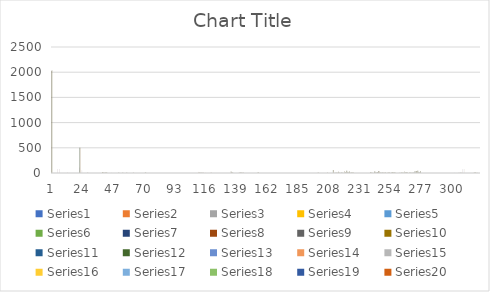
| Category | Series 0 | Series 1 | Series 2 | Series 3 | Series 4 | Series 5 | Series 6 | Series 7 | Series 8 | Series 9 | Series 10 | Series 11 | Series 12 | Series 13 | Series 14 | Series 15 | Series 16 | Series 17 | Series 18 | Series 19 |
|---|---|---|---|---|---|---|---|---|---|---|---|---|---|---|---|---|---|---|---|---|
| 0 | 2021 | 2022 | 2023 | 2024 | 2025 | 2026 | 2027 | 2028 | 2029 | 2030 | 2031 | 2032 | 2033 | 2034 | 2035 | 2036 | 2037 | 2038 | 2039 | 2040 |
| 1 | 0 | 0 | 0 | 0 | 0 | 0 | 0 | 0 | 0 | 0 | 0 | 0 | 0 | 0 | 0 | 0 | 0 | 0 | 0 | 0 |
| 2 | 0 | 0 | 0 | 0 | 0 | 0 | 0 | 0 | 0 | 0 | 0 | 0 | 0 | 0 | 0 | 0 | 0 | 0 | 0 | 0 |
| 3 | 0 | 0 | 0 | 0 | 0 | 0 | 0 | 0 | 0 | 0 | 0 | 0 | 0 | 0 | 0 | 0 | 0 | 0 | 0 | 0 |
| 4 | 0 | 0 | 0 | 0 | 0 | 0 | 0 | 0 | 0 | 0 | 0 | 0 | 0 | 0 | 0 | 0 | 0 | 0 | 0 | 0 |
| 5 | 78.394 | 77.848 | 77.764 | 0 | 0 | 0 | 0 | 0 | 0 | 0 | 0 | 0 | 0 | 0 | 0 | 0 | 0 | 0 | 0 | 0 |
| 6 | 79.574 | 79.02 | 78.935 | 0 | 0 | 0 | 0 | 0 | 0 | 0 | 0 | 0 | 0 | 0 | 0 | 0 | 0 | 0 | 0 | 0 |
| 7 | 0 | 0 | 0 | 0 | 0 | 0 | 0 | 0 | 0 | 0 | 0 | 0 | 0 | 0 | 0 | 0 | 0 | 0 | 0 | 0 |
| 8 | 0 | 0 | 0 | 0 | 0 | 0 | 0 | 0 | 0 | 0 | 0 | 0 | 0 | 0 | 0 | 0 | 0 | 0 | 0 | 0 |
| 9 | 0 | 0 | 0 | 0 | 0 | 0 | 0 | 0 | 0 | 0 | 0 | 0 | 0 | 0 | 0 | 0 | 0 | 0 | 0 | 0 |
| 10 | 0 | 0 | 0 | 0 | 0 | 0 | 0 | 0 | 0 | 0 | 0 | 0 | 0 | 0 | 0 | 0 | 0 | 0 | 0 | 0 |
| 11 | 0 | 0 | 0 | 0 | 0 | 0 | 0 | 0 | 0 | 0 | 0 | 0 | 0 | 0 | 0 | 0 | 0 | 0 | 0 | 0 |
| 12 | 16.387 | 16.273 | 16.256 | 0 | 0 | 0 | 0 | 0 | 0 | 0 | 0 | 0 | 0 | 0 | 0 | 0 | 0 | 0 | 0 | 0 |
| 13 | 0 | 0 | 0 | 0 | 0 | 0 | 0 | 0 | 0 | 0 | 0 | 0 | 0 | 0 | 0 | 0 | 0 | 0 | 0 | 0 |
| 14 | 0 | 0 | 0 | 0 | 0 | 0 | 0 | 0 | 0 | 0 | 0 | 0 | 0 | 0 | 0 | 0 | 0 | 0 | 0 | 0 |
| 15 | 0 | 0 | 0 | 0 | 0 | 0 | 0 | 0 | 0 | 0 | 0 | 0 | 0 | 0 | 0 | 0 | 0 | 0 | 0 | 0 |
| 16 | 0 | 0 | 0 | 0 | 0 | 0 | 0 | 0 | 0 | 0 | 0 | 0 | 0 | 0 | 0 | 0 | 0 | 0 | 0 | 0 |
| 17 | 0 | 0 | 0 | 0 | 0 | 0 | 0 | 0 | 0 | 0 | 0 | 0 | 0 | 0 | 0 | 0 | 0 | 0 | 0 | 0 |
| 18 | 0 | 0 | 0 | 0 | 0 | 0 | 0 | 0 | 0 | 0 | 0 | 0 | 0 | 0 | 0 | 0 | 0 | 0 | 0 | 0 |
| 19 | 0 | 0 | 0 | 0 | 0 | 0 | 0 | 0 | 0 | 0 | 0 | 0 | 0 | 0 | 0 | 0 | 0 | 0 | 0 | 0 |
| 20 | 0 | 0 | 0 | 0 | 0 | 0 | 0 | 0 | 0 | 0 | 0 | 0 | 0 | 0 | 0 | 0 | 0 | 0 | 0 | 0 |
| 21 | 110.726 | 109.955 | 109.836 | 500 | 500 | 500 | 500 | 500 | 500 | 500 | 500 | 500 | 500 | 500 | 500 | 500 | 500 | 500 | 500 | 500 |
| 22 | 0 | 0 | 0 | 0 | 0 | 0 | 0 | 0 | 0 | 0 | 0 | 0 | 0 | 0 | 0 | 0 | 0 | 0 | 0 | 0 |
| 23 | 52.484 | 52.118 | 52.062 | 0 | 0 | 0 | 0 | 0 | 0 | 0 | 0 | 0 | 0 | 0 | 0 | 0 | 0 | 0 | 0 | 0 |
| 24 | 0 | 0 | 0 | 0 | 0 | 0 | 0 | 0 | 0 | 0 | 0 | 0 | 0 | 0 | 0 | 0 | 0 | 0 | 0 | 0 |
| 25 | 0 | 0 | 0 | 0 | 0 | 0 | 0 | 0 | 0 | 0 | 0 | 0 | 0 | 0 | 0 | 0 | 0 | 0 | 0 | 0 |
| 26 | 0 | 0 | 0 | 0 | 0 | 0 | 0 | 0 | 0 | 0 | 0 | 0 | 0 | 0 | 0 | 0 | 0 | 0 | 0 | 0 |
| 27 | 2.564 | 2.557 | 2.549 | 2.567 | 2.567 | 2.567 | 2.567 | 2.567 | 2.567 | 2.567 | 2.567 | 2.567 | 2.567 | 2.567 | 2.567 | 2.567 | 2.567 | 0 | 0 | 0 |
| 28 | 0 | 0 | 0 | 0 | 0 | 0 | 0 | 0 | 0 | 0 | 0 | 0 | 0 | 0 | 0 | 0 | 0 | 0 | 0 | 0 |
| 29 | 0 | 0 | 0 | 0 | 0 | 0 | 0 | 0 | 0 | 0 | 0 | 0 | 0 | 0 | 0 | 0 | 0 | 0 | 0 | 0 |
| 30 | 0 | 0 | 0 | 0 | 0 | 0 | 0 | 0 | 0 | 0 | 0 | 0 | 0 | 0 | 0 | 0 | 0 | 0 | 0 | 0 |
| 31 | 0 | 0 | 0 | 0 | 0 | 0 | 0 | 0 | 0 | 0 | 0 | 0 | 0 | 0 | 0 | 0 | 0 | 0 | 0 | 0 |
| 32 | 0 | 0 | 0 | 0 | 0 | 0 | 0 | 0 | 0 | 0 | 0 | 0 | 0 | 0 | 0 | 0 | 0 | 0 | 0 | 0 |
| 33 | 0 | 0 | 0 | 0 | 0 | 0 | 0 | 0 | 0 | 0 | 0 | 0 | 0 | 0 | 0 | 0 | 0 | 0 | 0 | 0 |
| 34 | 0 | 0 | 0 | 0 | 0 | 0 | 0 | 0 | 0 | 0 | 0 | 0 | 0 | 0 | 0 | 0 | 0 | 0 | 0 | 0 |
| 35 | 0 | 0 | 0 | 0 | 0 | 0 | 0 | 0 | 0 | 0 | 0 | 0 | 0 | 0 | 0 | 0 | 0 | 0 | 0 | 0 |
| 36 | 0.28 | 0.279 | 0.278 | 0.28 | 0.28 | 0.28 | 0.28 | 0.28 | 0.28 | 0.28 | 0.28 | 0.28 | 0.28 | 0.28 | 0.28 | 0.28 | 0.28 | 0.28 | 0.28 | 0.28 |
| 37 | 0.332 | 0.331 | 0.329 | 0.332 | 0.332 | 0.332 | 0.332 | 0.332 | 0.332 | 0.332 | 0.332 | 0.332 | 0.332 | 0.332 | 0.332 | 0.332 | 0.332 | 0.332 | 0.332 | 0.332 |
| 38 | 19.173 | 19.118 | 19.054 | 19.189 | 19.189 | 19.189 | 19.189 | 19.189 | 19.189 | 19.189 | 19.189 | 19.189 | 19.189 | 19.189 | 19.189 | 19.189 | 19.189 | 19.189 | 19.189 | 19.189 |
| 39 | 5.592 | 5.576 | 5.558 | 5.597 | 5.597 | 5.597 | 5.597 | 5.597 | 5.597 | 5.597 | 5.597 | 5.597 | 5.597 | 5.597 | 5.597 | 5.597 | 5.597 | 5.597 | 5.597 | 5.597 |
| 40 | 10.705 | 10.674 | 10.639 | 10.714 | 10.714 | 10.714 | 10.714 | 10.714 | 10.714 | 10.714 | 10.714 | 10.714 | 10.714 | 10.714 | 10.714 | 10.714 | 10.714 | 10.714 | 10.714 | 10.714 |
| 41 | 10.865 | 10.833 | 10.797 | 10.874 | 10.874 | 10.874 | 10.874 | 10.874 | 10.874 | 10.874 | 10.874 | 10.874 | 10.874 | 10.874 | 10.874 | 10.874 | 10.874 | 10.874 | 10.874 | 10.874 |
| 42 | 1.598 | 1.593 | 0 | 0 | 0 | 0 | 0 | 0 | 0 | 0 | 0 | 0 | 0 | 0 | 0 | 0 | 0 | 0 | 0 | 0 |
| 43 | 2.157 | 2.151 | 0 | 0 | 0 | 0 | 0 | 0 | 0 | 0 | 0 | 0 | 0 | 0 | 0 | 0 | 0 | 0 | 0 | 0 |
| 44 | 1.438 | 1.434 | 0 | 0 | 0 | 0 | 0 | 0 | 0 | 0 | 0 | 0 | 0 | 0 | 0 | 0 | 0 | 0 | 0 | 0 |
| 45 | 7.828 | 7.805 | 0 | 0 | 0 | 0 | 0 | 0 | 0 | 0 | 0 | 0 | 0 | 0 | 0 | 0 | 0 | 0 | 0 | 0 |
| 46 | 1.198 | 1.195 | 1.191 | 1.199 | 1.199 | 1.199 | 1.199 | 1.199 | 1.199 | 1.199 | 1.199 | 1.199 | 1.199 | 1.199 | 1.199 | 1.199 | 1.199 | 1.199 | 1.199 | 1.199 |
| 47 | 2.077 | 2.071 | 2.064 | 2.079 | 2.079 | 2.079 | 2.079 | 2.079 | 2.079 | 2.079 | 2.079 | 2.079 | 2.079 | 2.079 | 2.079 | 2.079 | 2.079 | 2.079 | 2.079 | 2.079 |
| 48 | 0.879 | 0.876 | 0.873 | 0.88 | 0.88 | 0.88 | 0.88 | 0.88 | 0.88 | 0.88 | 0.88 | 0.88 | 0.88 | 0.88 | 0.88 | 0.88 | 0.88 | 0.88 | 0.88 | 0.88 |
| 49 | 2.317 | 2.31 | 2.302 | 2.319 | 2.319 | 2.319 | 2.319 | 2.319 | 2.319 | 2.319 | 2.319 | 2.319 | 2.319 | 2.319 | 2.319 | 2.319 | 2.319 | 2.319 | 2.319 | 2.319 |
| 50 | 2.636 | 2.629 | 2.62 | 2.639 | 2.639 | 2.639 | 2.639 | 2.639 | 2.639 | 2.639 | 2.639 | 2.639 | 2.639 | 2.639 | 2.639 | 2.639 | 2.639 | 2.639 | 2.639 | 2.639 |
| 51 | 1.438 | 1.434 | 1.429 | 1.439 | 1.439 | 1.439 | 1.439 | 1.439 | 1.439 | 1.439 | 1.439 | 1.439 | 1.439 | 1.439 | 1.439 | 1.439 | 1.439 | 1.439 | 1.439 | 1.439 |
| 52 | 0.879 | 0.876 | 0.873 | 0.88 | 0.88 | 0.88 | 0.88 | 0.88 | 0.88 | 0.88 | 0.88 | 0.88 | 0.88 | 0.88 | 0.88 | 0.88 | 0.88 | 0.88 | 0.88 | 0.88 |
| 53 | 3.395 | 3.385 | 3.374 | 3.398 | 3.398 | 3.398 | 3.398 | 3.398 | 3.398 | 3.398 | 3.398 | 3.398 | 3.398 | 3.398 | 3.398 | 3.398 | 3.398 | 3.398 | 3.398 | 3.398 |
| 54 | 0.224 | 0.223 | 0.222 | 0.224 | 0.224 | 0.224 | 0.224 | 0.224 | 0.224 | 0.224 | 0.224 | 0.224 | 0.224 | 0.224 | 0.224 | 0.224 | 0.224 | 0.224 | 0.224 | 0.224 |
| 55 | 0.367 | 0.366 | 0.365 | 0.368 | 0.368 | 0.368 | 0.368 | 0.368 | 0.368 | 0.368 | 0.368 | 0.368 | 0.368 | 0.368 | 0.368 | 0.368 | 0.368 | 0.368 | 0.368 | 0.368 |
| 56 | 2.876 | 2.868 | 2.858 | 2.878 | 2.878 | 2.878 | 2.878 | 2.878 | 2.878 | 2.878 | 2.878 | 2.878 | 2.878 | 2.878 | 2.878 | 2.878 | 2.878 | 2.878 | 2.878 | 2.878 |
| 57 | 0.575 | 0.574 | 0.572 | 0.576 | 0.576 | 0.576 | 0.576 | 0.576 | 0.576 | 0.576 | 0.576 | 0.576 | 0.576 | 0.576 | 0.576 | 0.576 | 0.576 | 0.576 | 0.576 | 0.576 |
| 58 | 0.072 | 0.072 | 0.071 | 0.072 | 0.072 | 0.072 | 0.072 | 0.072 | 0.072 | 0.072 | 0.072 | 0.072 | 0.072 | 0.072 | 0.072 | 0.072 | 0.072 | 0.072 | 0.072 | 0.072 |
| 59 | 0.627 | 0.625 | 0.623 | 0.628 | 0.628 | 0.628 | 0.628 | 0.628 | 0.628 | 0.628 | 0.628 | 0.628 | 0.628 | 0.628 | 0.628 | 0.628 | 0.628 | 0.628 | 0.628 | 0.628 |
| 60 | 2.397 | 2.39 | 2.382 | 2.399 | 2.399 | 2.399 | 2.399 | 2.399 | 2.399 | 2.399 | 2.399 | 2.399 | 2.399 | 2.399 | 2.399 | 2.399 | 2.399 | 2.399 | 2.399 | 2.399 |
| 61 | 2.636 | 2.629 | 2.62 | 2.639 | 2.639 | 2.639 | 2.639 | 2.639 | 2.639 | 2.639 | 2.639 | 2.639 | 2.639 | 2.639 | 2.639 | 2.639 | 2.639 | 2.639 | 2.639 | 2.639 |
| 62 | 0.087 | 0.087 | 0.087 | 0.087 | 0.087 | 0.087 | 0.087 | 0.087 | 0.087 | 0.087 | 0.087 | 0.087 | 0.087 | 0.087 | 0.087 | 0.087 | 0.087 | 0.087 | 0.087 | 0.087 |
| 63 | 2.397 | 2.39 | 2.382 | 2.399 | 2.399 | 2.399 | 2.399 | 2.399 | 2.399 | 2.399 | 2.399 | 2.399 | 2.399 | 2.399 | 2.399 | 2.399 | 2.399 | 2.399 | 2.399 | 2.399 |
| 64 | 1.118 | 1.115 | 1.112 | 1.119 | 1.119 | 1.119 | 1.119 | 1.119 | 1.119 | 1.119 | 1.119 | 1.119 | 1.119 | 1.119 | 1.119 | 1.119 | 1.119 | 1.119 | 1.119 | 1.119 |
| 65 | 0.63 | 0.628 | 0.626 | 0.631 | 0.631 | 0.631 | 0.631 | 0.631 | 0.631 | 0.631 | 0.631 | 0.631 | 0.631 | 0.631 | 0.631 | 0.631 | 0.631 | 0.631 | 0.631 | 0.631 |
| 66 | 0.021 | 0.021 | 0.021 | 0.021 | 0.021 | 0.021 | 0.021 | 0.021 | 0.021 | 0.021 | 0.021 | 0.021 | 0.021 | 0.021 | 0.021 | 0.021 | 0.021 | 0.021 | 0.021 | 0.021 |
| 67 | 0.28 | 0.279 | 0.278 | 0.28 | 0.28 | 0.28 | 0.28 | 0.28 | 0.28 | 0.28 | 0.28 | 0.28 | 0.28 | 0.28 | 0.28 | 0.28 | 0.28 | 0.28 | 0.28 | 0.28 |
| 68 | 0.088 | 0.088 | 0.087 | 0.088 | 0.088 | 0.088 | 0.088 | 0.088 | 0.088 | 0.088 | 0.088 | 0.088 | 0.088 | 0.088 | 0.088 | 0.088 | 0.088 | 0.088 | 0.088 | 0.088 |
| 69 | 1.758 | 1.752 | 1.747 | 0 | 0 | 0 | 0 | 0 | 0 | 0 | 0 | 0 | 0 | 0 | 0 | 0 | 0 | 0 | 0 | 0 |
| 70 | 10.386 | 10.356 | 10.321 | 10.394 | 10.394 | 10.394 | 10.394 | 10.394 | 10.394 | 10.394 | 10.394 | 10.394 | 10.394 | 10.394 | 10.394 | 10.394 | 10.394 | 10.394 | 10.394 | 10.394 |
| 71 | 0 | 0 | 0 | 0 | 0 | 0 | 0 | 0 | 0 | 0 | 0 | 0 | 0 | 0 | 0 | 0 | 0 | 0 | 0 | 0 |
| 72 | 0 | 0 | 0 | 0 | 0 | 0 | 0 | 0 | 0 | 0 | 0 | 0 | 0 | 0 | 0 | 0 | 0 | 0 | 0 | 0 |
| 73 | 0 | 0 | 0 | 0 | 0 | 0 | 0 | 0 | 0 | 0 | 0 | 0 | 0 | 0 | 0 | 0 | 0 | 0 | 0 | 0 |
| 74 | 0 | 0 | 0 | 0 | 0 | 0 | 0 | 0 | 0 | 0 | 0 | 0 | 0 | 0 | 0 | 0 | 0 | 0 | 0 | 0 |
| 75 | 0 | 0 | 0 | 0 | 0 | 0 | 0 | 0 | 0 | 0 | 0 | 0 | 0 | 0 | 0 | 0 | 0 | 0 | 0 | 0 |
| 76 | 0 | 0 | 0 | 0 | 0 | 0 | 0 | 0 | 0 | 0 | 0 | 0 | 0 | 0 | 0 | 0 | 0 | 0 | 0 | 0 |
| 77 | 0 | 0 | 0 | 0 | 0 | 0 | 0 | 0 | 0 | 0 | 0 | 0 | 0 | 0 | 0 | 0 | 0 | 0 | 0 | 0 |
| 78 | 0 | 0 | 0 | 0 | 0 | 0 | 0 | 0 | 0 | 0 | 0 | 0 | 0 | 0 | 0 | 0 | 0 | 0 | 0 | 0 |
| 79 | 0 | 0 | 0 | 0 | 0 | 0 | 0 | 0 | 0 | 0 | 0 | 0 | 0 | 0 | 0 | 0 | 0 | 0 | 0 | 0 |
| 80 | 0 | 0 | 0 | 0 | 0 | 0 | 0 | 0 | 0 | 0 | 0 | 0 | 0 | 0 | 0 | 0 | 0 | 0 | 0 | 0 |
| 81 | 0 | 0 | 0 | 0 | 0 | 0 | 0 | 0 | 0 | 0 | 0 | 0 | 0 | 0 | 0 | 0 | 0 | 0 | 0 | 0 |
| 82 | 0 | 0 | 0 | 0 | 0 | 0 | 0 | 0 | 0 | 0 | 0 | 0 | 0 | 0 | 0 | 0 | 0 | 0 | 0 | 0 |
| 83 | 0 | 0 | 0 | 0 | 0 | 0 | 0 | 0 | 0 | 0 | 0 | 0 | 0 | 0 | 0 | 0 | 0 | 0 | 0 | 0 |
| 84 | 0 | 0 | 0 | 0 | 0 | 0 | 0 | 0 | 0 | 0 | 0 | 0 | 0 | 0 | 0 | 0 | 0 | 0 | 0 | 0 |
| 85 | 0 | 0 | 0 | 0 | 0 | 0 | 0 | 0 | 0 | 0 | 0 | 0 | 0 | 0 | 0 | 0 | 0 | 0 | 0 | 0 |
| 86 | 0 | 0 | 0 | 0 | 0 | 0 | 0 | 0 | 0 | 0 | 0 | 0 | 0 | 0 | 0 | 0 | 0 | 0 | 0 | 0 |
| 87 | 0 | 0 | 0 | 0 | 0 | 0 | 0 | 0 | 0 | 0 | 0 | 0 | 0 | 0 | 0 | 0 | 0 | 0 | 0 | 0 |
| 88 | 0 | 0 | 0 | 0 | 0 | 0 | 0 | 0 | 0 | 0 | 0 | 0 | 0 | 0 | 0 | 0 | 0 | 0 | 0 | 0 |
| 89 | 0 | 0 | 0 | 0 | 0 | 0 | 0 | 0 | 0 | 0 | 0 | 0 | 0 | 0 | 0 | 0 | 0 | 0 | 0 | 0 |
| 90 | 0 | 0 | 0 | 0 | 0 | 0 | 0 | 0 | 0 | 0 | 0 | 0 | 0 | 0 | 0 | 0 | 0 | 0 | 0 | 0 |
| 91 | 0 | 0 | 0 | 0 | 0 | 0 | 0 | 0 | 0 | 0 | 0 | 0 | 0 | 0 | 0 | 0 | 0 | 0 | 0 | 0 |
| 92 | 0 | 0 | 0 | 0 | 0 | 0 | 0 | 0 | 0 | 0 | 0 | 0 | 0 | 0 | 0 | 0 | 0 | 0 | 0 | 0 |
| 93 | 0 | 0 | 0 | 0 | 0 | 0 | 0 | 0 | 0 | 0 | 0 | 0 | 0 | 0 | 0 | 0 | 0 | 0 | 0 | 0 |
| 94 | 0 | 0 | 0 | 0 | 0 | 0 | 0 | 0 | 0 | 0 | 0 | 0 | 0 | 0 | 0 | 0 | 0 | 0 | 0 | 0 |
| 95 | 0 | 0 | 0 | 0 | 0 | 0 | 0 | 0 | 0 | 0 | 0 | 0 | 0 | 0 | 0 | 0 | 0 | 0 | 0 | 0 |
| 96 | 0 | 0 | 0 | 0 | 0 | 0 | 0 | 0 | 0 | 0 | 0 | 0 | 0 | 0 | 0 | 0 | 0 | 0 | 0 | 0 |
| 97 | 0 | 0 | 0 | 0 | 0 | 0 | 0 | 0 | 0 | 0 | 0 | 0 | 0 | 0 | 0 | 0 | 0 | 0 | 0 | 0 |
| 98 | 0 | 0 | 0 | 0 | 0 | 0 | 0 | 0 | 0 | 0 | 0 | 0 | 0 | 0 | 0 | 0 | 0 | 0 | 0 | 0 |
| 99 | 0 | 0 | 0 | 0 | 0 | 0 | 0 | 0 | 0 | 0 | 0 | 0 | 0 | 0 | 0 | 0 | 0 | 0 | 0 | 0 |
| 100 | 0 | 0 | 0 | 0 | 0 | 0 | 0 | 0 | 0 | 0 | 0 | 0 | 0 | 0 | 0 | 0 | 0 | 0 | 0 | 0 |
| 101 | 0 | 0 | 0 | 0 | 0 | 0 | 0 | 0 | 0 | 0 | 0 | 0 | 0 | 0 | 0 | 0 | 0 | 0 | 0 | 0 |
| 102 | 0 | 0 | 0 | 0 | 0 | 0 | 0 | 0 | 0 | 0 | 0 | 0 | 0 | 0 | 0 | 0 | 0 | 0 | 0 | 0 |
| 103 | 0 | 0 | 0 | 0 | 0 | 0 | 0 | 0 | 0 | 0 | 0 | 0 | 0 | 0 | 0 | 0 | 0 | 0 | 0 | 0 |
| 104 | 0 | 0 | 0 | 0 | 0 | 0 | 0 | 0 | 0 | 0 | 0 | 0 | 0 | 0 | 0 | 0 | 0 | 0 | 0 | 0 |
| 105 | 0 | 0 | 0 | 0 | 0 | 0 | 0 | 0 | 0 | 0 | 0 | 0 | 0 | 0 | 0 | 0 | 0 | 0 | 0 | 0 |
| 106 | 0 | 0 | 0 | 0 | 0 | 0 | 0 | 0 | 0 | 0 | 0 | 0 | 0 | 0 | 0 | 0 | 0 | 0 | 0 | 0 |
| 107 | 0 | 0 | 0 | 0 | 0 | 0 | 0 | 0 | 0 | 0 | 0 | 0 | 0 | 0 | 0 | 0 | 0 | 0 | 0 | 0 |
| 108 | 0 | 0 | 0 | 0 | 0 | 0 | 0 | 0 | 0 | 0 | 0 | 0 | 0 | 0 | 0 | 0 | 0 | 0 | 0 | 0 |
| 109 | 0 | 0 | 0 | 0 | 0 | 0 | 0 | 0 | 0 | 0 | 0 | 0 | 0 | 0 | 0 | 0 | 0 | 0 | 0 | 24.992 |
| 110 | 8.628 | 8.603 | 8.574 | 8.635 | 8.635 | 8.635 | 8.635 | 8.635 | 8.635 | 8.635 | 8.635 | 8.635 | 8.635 | 8.635 | 8.635 | 8.635 | 8.635 | 8.635 | 8.635 | 8.635 |
| 111 | 5.353 | 5.337 | 5.319 | 5.357 | 5.357 | 5.357 | 5.357 | 5.357 | 5.357 | 5.357 | 5.357 | 5.357 | 5.357 | 5.357 | 5.357 | 5.357 | 5.357 | 5.357 | 5.357 | 5.357 |
| 112 | 5.512 | 5.496 | 5.478 | 5.517 | 5.517 | 5.517 | 5.517 | 5.517 | 5.517 | 5.345 | 5.517 | 5.517 | 5.359 | 5.227 | 5.161 | 5.093 | 5.35 | 5.219 | 5.192 | 5.123 |
| 113 | 3.795 | 3.784 | 3.771 | 3.798 | 3.798 | 3.798 | 3.798 | 3.798 | 3.798 | 3.798 | 3.798 | 3.798 | 3.798 | 3.798 | 3.798 | 3.798 | 3.798 | 3.798 | 3.798 | 3.798 |
| 114 | 0 | 0 | 0 | 0 | 0 | 0 | 0 | 0 | 0 | 0 | 0 | 0 | 0 | 0 | 0 | 0 | 0 | 0 | 0 | 0 |
| 115 | 7.309 | 7.288 | 7.264 | 7.315 | 0 | 0 | 0 | 0 | 0 | 0 | 0 | 0 | 0 | 0 | 0 | 0 | 0 | 0 | 0 | 0 |
| 116 | 0.109 | 0.109 | 0.109 | 0.11 | 0.11 | 0.11 | 0.11 | 0.11 | 0.11 | 0.11 | 0.11 | 0.11 | 0.11 | 0.11 | 0.11 | 0.11 | 0.11 | 0.11 | 0.11 | 0.11 |
| 117 | 0.139 | 0.139 | 0.138 | 0 | 0 | 0 | 0 | 0 | 0 | 0 | 0 | 0 | 0 | 0 | 0 | 0 | 0 | 0 | 0 | 0 |
| 118 | 2.012 | 2.007 | 2 | 0 | 0 | 0 | 0 | 0 | 0 | 0 | 0 | 0 | 0 | 0 | 0 | 0 | 0 | 0 | 0 | 0 |
| 119 | 6.172 | 6.154 | 6.134 | 6.177 | 6.177 | 6.177 | 6.177 | 6.177 | 6.177 | 6.177 | 6.177 | 6.177 | 6.177 | 6.177 | 6.177 | 6.177 | 6.177 | 6.177 | 6.177 | 6.177 |
| 120 | 0.611 | 0 | 0 | 0 | 0 | 0 | 0 | 0 | 0 | 0 | 0 | 0 | 0 | 0 | 0 | 0 | 0 | 0 | 0 | 0 |
| 121 | 0.259 | 0 | 0 | 0 | 0 | 0 | 0 | 0 | 0 | 0 | 0 | 0 | 0 | 0 | 0 | 0 | 0 | 0 | 0 | 0 |
| 122 | 0.786 | 0.783 | 0.781 | 0 | 0 | 0 | 0 | 0 | 0 | 0 | 0 | 0 | 0 | 0 | 0 | 0 | 0 | 0 | 0 | 0 |
| 123 | 0.142 | 0.142 | 0.141 | 0 | 0 | 0 | 0 | 0 | 0 | 0 | 0 | 0 | 0 | 0 | 0 | 0 | 0 | 0 | 0 | 0 |
| 124 | 1.217 | 1.214 | 1.21 | 0 | 0 | 0 | 0 | 0 | 0 | 0 | 0 | 0 | 0 | 0 | 0 | 0 | 0 | 0 | 0 | 0 |
| 125 | 0.583 | 0.582 | 0.58 | 0.584 | 0.584 | 0.584 | 0.584 | 0.584 | 0.584 | 0.584 | 0.584 | 0.584 | 0.584 | 0.584 | 0.584 | 0.584 | 0.584 | 0.584 | 0.584 | 0.584 |
| 126 | 0.583 | 0.582 | 0.58 | 0.584 | 0.584 | 0.584 | 0.584 | 0.584 | 0.584 | 0.584 | 0.584 | 0.584 | 0.584 | 0.584 | 0.584 | 0.584 | 0.584 | 0.584 | 0.584 | 0.584 |
| 127 | 0.032 | 0.032 | 0.032 | 0.032 | 0.032 | 0.032 | 0.032 | 0.032 | 0.032 | 0.032 | 0.032 | 0.032 | 0.032 | 0.032 | 0.032 | 0.032 | 0.032 | 0.032 | 0.032 | 0.032 |
| 128 | 0.032 | 0.032 | 0.032 | 0.032 | 0.032 | 0.032 | 0.032 | 0.032 | 0.032 | 0.032 | 0.032 | 0.032 | 0.032 | 0.032 | 0.032 | 0.032 | 0.032 | 0.032 | 0.032 | 0.032 |
| 129 | 2.301 | 2.294 | 2.287 | 2.303 | 2.303 | 2.303 | 2.303 | 2.303 | 2.303 | 2.303 | 2.303 | 2.303 | 2.303 | 2.303 | 2.303 | 2.303 | 2.303 | 2.303 | 2.303 | 2.303 |
| 130 | 2.301 | 2.294 | 2.287 | 2.303 | 2.303 | 2.303 | 2.303 | 2.303 | 2.303 | 2.303 | 2.303 | 2.303 | 2.303 | 2.303 | 2.303 | 2.303 | 2.303 | 2.303 | 2.303 | 2.303 |
| 131 | 0.192 | 0.191 | 0.191 | 0.192 | 0.192 | 0.192 | 0.192 | 0.192 | 0.192 | 0.192 | 0.192 | 0.192 | 0.192 | 0.192 | 0.192 | 0.192 | 0.192 | 0.192 | 0.192 | 0.192 |
| 132 | 0.192 | 0.191 | 0.191 | 0.192 | 0.192 | 0.192 | 0.192 | 0.192 | 0.192 | 0.192 | 0.192 | 0.192 | 0.192 | 0.192 | 0.192 | 0.192 | 0.192 | 0.192 | 0.192 | 0.192 |
| 133 | 0 | 0 | 0 | 0 | 0 | 0 | 0 | 0 | 0 | 0 | 0 | 0 | 0 | 0 | 0 | 0 | 0 | 34.49 | 34.49 | 34.49 |
| 134 | 0 | 0 | 0 | 0 | 0 | 0 | 0 | 25.735 | 25.735 | 25.735 | 25.735 | 25.735 | 25.735 | 25.735 | 25.735 | 25.735 | 25.735 | 25.735 | 25.735 | 25.735 |
| 135 | 7.973 | 7.91 | 7.844 | 7.86 | 7.821 | 7.782 | 7.743 | 7.705 | 7.666 | 7.628 | 7.589 | 7.552 | 7.514 | 7.477 | 7.439 | 7.402 | 7.365 | 7.328 | 7.291 | 7.254 |
| 136 | 0 | 0 | 0 | 0 | 0 | 0 | 0 | 0 | 0 | 0 | 0 | 0 | 0 | 0 | 0 | 0 | 0 | 0 | 0 | 0 |
| 137 | 0 | 0 | 0 | 0 | 0 | 0 | 0 | 0 | 0 | 0 | 0 | 0 | 0 | 0 | 0 | 0 | 0 | 0 | 0 | 0 |
| 138 | 0 | 0 | 0 | 0 | 0 | 0 | 0 | 0 | 0 | 0 | 0 | 0 | 0 | 0 | 0 | 0 | 0 | 0 | 0 | 0 |
| 139 | 0 | 0 | 0 | 0 | 0 | 0 | 0 | 0 | 0 | 0 | 0 | 0 | 0 | 0 | 0 | 0 | 0 | 0 | 0 | 0 |
| 140 | 4.634 | 4.602 | 4.568 | 4.582 | 4.564 | 4.545 | 4.527 | 4.509 | 4.49 | 4.473 | 4.455 | 4.438 | 4.42 | 4.402 | 4.385 | 4.367 | 4.35 | 4.332 | 4.314 | 4.297 |
| 141 | 7.949 | 7.886 | 7.821 | 7.837 | 7.798 | 7.759 | 7.72 | 7.681 | 7.643 | 7.605 | 7.566 | 7.529 | 7.491 | 7.453 | 7.416 | 7.379 | 7.342 | 7.306 | 7.269 | 7.233 |
| 142 | 7.909 | 7.827 | 7.742 | 7.739 | 7.681 | 7.623 | 7.565 | 7.509 | 7.453 | 7.397 | 7.342 | 7.286 | 7.232 | 7.178 | 7.124 | 7.071 | 7.018 | 6.965 | 6.913 | 6.861 |
| 143 | 6.359 | 6.309 | 6.256 | 6.269 | 6.238 | 6.207 | 6.176 | 6.145 | 6.114 | 6.084 | 6.053 | 6.023 | 5.993 | 5.963 | 5.934 | 5.904 | 5.874 | 5.845 | 5.815 | 5.786 |
| 144 | 0 | 0 | 0 | 0 | 0 | 0 | 0 | 0 | 0 | 0 | 0 | 0 | 0 | 0 | 0 | 0 | 0 | 0 | 0 | 0 |
| 145 | 0 | 0 | 0 | 0 | 0 | 0 | 0 | 0 | 0 | 0 | 0 | 0 | 0 | 0 | 0 | 0 | 0 | 0 | 0 | 0 |
| 146 | 0 | 0 | 0 | 0 | 0 | 0 | 0 | 0 | 0 | 0 | 0 | 0 | 0 | 0 | 0 | 0 | 0 | 0 | 0 | 0 |
| 147 | 0 | 0 | 0 | 0 | 0 | 0 | 0 | 0 | 0 | 0 | 0 | 0 | 0 | 0 | 0 | 0 | 0 | 0 | 0 | 0 |
| 148 | 0 | 0 | 0 | 0 | 0 | 0 | 0 | 0 | 0 | 0 | 0 | 0 | 0 | 0 | 0 | 0 | 0 | 0 | 0 | 0 |
| 149 | 0 | 0 | 0 | 0 | 0 | 0 | 0 | 0 | 0 | 0 | 0 | 0 | 0 | 0 | 0 | 0 | 0 | 0 | 0 | 0 |
| 150 | 0 | 0 | 0 | 0 | 0 | 0 | 0 | 0 | 0 | 0 | 0 | 0 | 0 | 0 | 0 | 0 | 0 | 0 | 0 | 0 |
| 151 | 0 | 0 | 0 | 0 | 0 | 0 | 0 | 0 | 0 | 0 | 0 | 0 | 0 | 0 | 0 | 0 | 0 | 0 | 0 | 0 |
| 152 | 0 | 0 | 0 | 0 | 0 | 0 | 0 | 0 | 0 | 0 | 0 | 0 | 0 | 0 | 0 | 0 | 0 | 0 | 0 | 0 |
| 153 | 0 | 0 | 0 | 0 | 0 | 0 | 0 | 0 | 0 | 0 | 0 | 0 | 0 | 0 | 0 | 0 | 0 | 0 | 0 | 0 |
| 154 | 0 | 0 | 0 | 14.195 | 14.195 | 14.124 | 14.053 | 13.983 | 13.913 | 13.843 | 13.774 | 13.705 | 13.637 | 13.569 | 13.501 | 13.433 | 13.366 | 13.299 | 13.233 | 13.167 |
| 155 | 0 | 0 | 0 | 0 | 0 | 0 | 0 | 0 | 0 | 0 | 0 | 0 | 0 | 0 | 0 | 0 | 0 | 0 | 0 | 0 |
| 156 | 2.164 | 2.149 | 2.146 | 2.171 | 2.171 | 2.171 | 2.171 | 2.171 | 2.171 | 0 | 0 | 0 | 0 | 0 | 0 | 0 | 0 | 0 | 0 | 0 |
| 157 | 2.182 | 2.166 | 2.164 | 2.189 | 2.189 | 2.189 | 2.189 | 2.189 | 2.189 | 0 | 0 | 0 | 0 | 0 | 0 | 0 | 0 | 0 | 0 | 0 |
| 158 | 2.164 | 2.149 | 2.146 | 2.171 | 2.171 | 2.171 | 2.171 | 2.171 | 2.171 | 0 | 0 | 0 | 0 | 0 | 0 | 0 | 0 | 0 | 0 | 0 |
| 159 | 0 | 0 | 0 | 0 | 0 | 0 | 0 | 0 | 0 | 0 | 0 | 0 | 0 | 0 | 0 | 0 | 0 | 0 | 0 | 0 |
| 160 | 1.843 | 1.83 | 1.828 | 1.85 | 1.85 | 1.85 | 1.85 | 1.85 | 1.85 | 0 | 0 | 0 | 0 | 0 | 0 | 0 | 0 | 0 | 0 | 0 |
| 161 | 0 | 0 | 0 | 0 | 0 | 0 | 0 | 0 | 0 | 0 | 0 | 0 | 0 | 0 | 0 | 0 | 0 | 0 | 0 | 0 |
| 162 | 0 | 0 | 0 | 0 | 0 | 0 | 0 | 0 | 0 | 0 | 0 | 0 | 0 | 0 | 0 | 0 | 0 | 0 | 0 | 0 |
| 163 | 0 | 0 | 0 | 0 | 0 | 0 | 0 | 0 | 0 | 0 | 0 | 0 | 0 | 0 | 0 | 0 | 0 | 0 | 0 | 0 |
| 164 | 0 | 0 | 0 | 0 | 0 | 0 | 0 | 0 | 0 | 0 | 0 | 0 | 0 | 0 | 0 | 0 | 0 | 0 | 0 | 0 |
| 165 | 0 | 0 | 0 | 0 | 0 | 0 | 0 | 0 | 0 | 0 | 0 | 0 | 0 | 0 | 0 | 0 | 0 | 0 | 0 | 0 |
| 166 | 0 | 0 | 0 | 0 | 0 | 0 | 0 | 0 | 0 | 0 | 0 | 0 | 0 | 0 | 0 | 0 | 0 | 0 | 0 | 0 |
| 167 | 0 | 0 | 0 | 0 | 0 | 0 | 0 | 0 | 0 | 0 | 0 | 0 | 0 | 0 | 0 | 0 | 0 | 0 | 0 | 0 |
| 168 | 0 | 0 | 0 | 0 | 0 | 0 | 0 | 0 | 0 | 0 | 0 | 0 | 0 | 0 | 0 | 0 | 0 | 0 | 0 | 0 |
| 169 | 0 | 0 | 0 | 0 | 0 | 0 | 0 | 0 | 0 | 0 | 0 | 0 | 0 | 0 | 0 | 0 | 0 | 0 | 0 | 0 |
| 170 | 0 | 0 | 0 | 0 | 0 | 0 | 0 | 0 | 0 | 0 | 0 | 0 | 0 | 0 | 0 | 0 | 0 | 0 | 0 | 0 |
| 171 | 0 | 0 | 0 | 0 | 0 | 0 | 0 | 0 | 0 | 0 | 0 | 0 | 0 | 0 | 0 | 0 | 0 | 0 | 0 | 0 |
| 172 | 0 | 0 | 0 | 0 | 0 | 0 | 0 | 0 | 0 | 0 | 0 | 0 | 0 | 0 | 0 | 0 | 0 | 0 | 0 | 0 |
| 173 | 0 | 0 | 0 | 0 | 0 | 0 | 0 | 0 | 0 | 0 | 0 | 0 | 0 | 0 | 0 | 0 | 0 | 0 | 0 | 0 |
| 174 | 0 | 0 | 0 | 0 | 0 | 0 | 0 | 0 | 0 | 0 | 0 | 0 | 0 | 0 | 0 | 0 | 0 | 0 | 0 | 0 |
| 175 | 0 | 0 | 0 | 0 | 0 | 0 | 0 | 0 | 0 | 0 | 0 | 0 | 0 | 0 | 0 | 0 | 0 | 0 | 0 | 0 |
| 176 | 0 | 0 | 0 | 0 | 0 | 0 | 0 | 0 | 0 | 0 | 0 | 0 | 0 | 0 | 0 | 0 | 0 | 0 | 0 | 0 |
| 177 | 0 | 0 | 0 | 0 | 0 | 0 | 0 | 0 | 0 | 0 | 0 | 0 | 0 | 0 | 0 | 0 | 0 | 0 | 0 | 0 |
| 178 | 0 | 0 | 0 | 0 | 0 | 0 | 0 | 0 | 0 | 0 | 0 | 0 | 0 | 0 | 0 | 0 | 0 | 0 | 0 | 0 |
| 179 | 0 | 0 | 0 | 0 | 0 | 0 | 0 | 0 | 0 | 0 | 0 | 0 | 0 | 0 | 0 | 0 | 0 | 0 | 0 | 0 |
| 180 | 0 | 0 | 0 | 0 | 0 | 0 | 0 | 0 | 0 | 0 | 0 | 0 | 0 | 0 | 0 | 0 | 0 | 0 | 0 | 0 |
| 181 | 0 | 0 | 0 | 0 | 0 | 0 | 0 | 0 | 0 | 0 | 0 | 0 | 0 | 0 | 0 | 0 | 0 | 0 | 0 | 0 |
| 182 | 0 | 0 | 0 | 0 | 0 | 0 | 0 | 0 | 0 | 0 | 0 | 0 | 0 | 0 | 0 | 0 | 0 | 0 | 0 | 0 |
| 183 | 0 | 0 | 0 | 0 | 0 | 0 | 0 | 0 | 0 | 0 | 0 | 0 | 0 | 0 | 0 | 0 | 0 | 0 | 0 | 0 |
| 184 | 0 | 0 | 0 | 0 | 0 | 0 | 0 | 0 | 0 | 0 | 0 | 0 | 0 | 0 | 0 | 0 | 0 | 0 | 0 | 0 |
| 185 | 0 | 0 | 0 | 0 | 0 | 0 | 0 | 0 | 0 | 0 | 0 | 0 | 0 | 0 | 0 | 0 | 0 | 0 | 0 | 0 |
| 186 | 0 | 0 | 0 | 0 | 0 | 0 | 0 | 0 | 0 | 0 | 0 | 0 | 0 | 0 | 0 | 0 | 0 | 0 | 0 | 0 |
| 187 | 0 | 0 | 0 | 0 | 0 | 0 | 0 | 0 | 0 | 0 | 0 | 0 | 0 | 0 | 0 | 0 | 0 | 0 | 0 | 0 |
| 188 | 0 | 0 | 0 | 0 | 0 | 0 | 0 | 0 | 0 | 0 | 0 | 0 | 0 | 0 | 0 | 0 | 0 | 0 | 0 | 0 |
| 189 | 0 | 0 | 0 | 0 | 0 | 0 | 0 | 0 | 0 | 0 | 0 | 0 | 0 | 0 | 0 | 0 | 0 | 0 | 0 | 0 |
| 190 | 0 | 0 | 0 | 0 | 0 | 0 | 0 | 0 | 0 | 0 | 0 | 0 | 0 | 0 | 0 | 0 | 0 | 0 | 0 | 0 |
| 191 | 0 | 0 | 0 | 0 | 0 | 0 | 0 | 0 | 0 | 0 | 0 | 0 | 0 | 0 | 0 | 0 | 0 | 0 | 0 | 0 |
| 192 | 0 | 0 | 0 | 0 | 0 | 0 | 0 | 0 | 0 | 0 | 0 | 0 | 0 | 0 | 0 | 0 | 0 | 0 | 0 | 0 |
| 193 | 0 | 0 | 0 | 0 | 0 | 0 | 0 | 0 | 0 | 0 | 0 | 0 | 0 | 0 | 0 | 0 | 0 | 0 | 0 | 0 |
| 194 | 0 | 0 | 0 | 0 | 0 | 0 | 0 | 0 | 0 | 0 | 0 | 0 | 0 | 0 | 0 | 0 | 0 | 0 | 0 | 0 |
| 195 | 0 | 0 | 0 | 0 | 0 | 0 | 0 | 0 | 0 | 0 | 0 | 0 | 0 | 0 | 0 | 0 | 0 | 0 | 0 | 0 |
| 196 | 0 | 0 | 0 | 0 | 0 | 0 | 0 | 0 | 0 | 0 | 0 | 0 | 0 | 0 | 0 | 0 | 0 | 0 | 0 | 0 |
| 197 | 0 | 0 | 0 | 0 | 0 | 0 | 0 | 0 | 0 | 0 | 0 | 0 | 0 | 0 | 0 | 0 | 0 | 0 | 0 | 0 |
| 198 | 0 | 0 | 0 | 0 | 0 | 0 | 0 | 0 | 0 | 0 | 0 | 0 | 0 | 0 | 0 | 0 | 0 | 0 | 0 | 0 |
| 199 | 17.428 | 17.168 | 17.014 | 17.074 | 16.938 | 16.802 | 16.669 | 16.536 | 16.402 | 0 | 0 | 0 | 0 | 0 | 0 | 0 | 0 | 0 | 0 | 0 |
| 200 | 0 | 0 | 0 | 0 | 0 | 0 | 0 | 0 | 0 | 0 | 0 | 0 | 0 | 0 | 0 | 0 | 0 | 0 | 0 | 0 |
| 201 | 0 | 0 | 0 | 0 | 0 | 0 | 0 | 0 | 0 | 0 | 0 | 0 | 0 | 0 | 0 | 0 | 0 | 0 | 0 | 0 |
| 202 | 0 | 0 | 0 | 0 | 0 | 0 | 0 | 0 | 0 | 0 | 0 | 0 | 0 | 0 | 0 | 0 | 0 | 0 | 0 | 0 |
| 203 | 0 | 0 | 0 | 0 | 0 | 0 | 0 | 0 | 0 | 0 | 0 | 0 | 0 | 0 | 0 | 0 | 0 | 0 | 0 | 0 |
| 204 | 0 | 0 | 0 | 0 | 0 | 0 | 0 | 0 | 0 | 0 | 0 | 0 | 0 | 0 | 0 | 0 | 0 | 0 | 0 | 0 |
| 205 | 0 | 0 | 0 | 0 | 0 | 0 | 0 | 0 | 0 | 0 | 0 | 0 | 0 | 0 | 0 | 0 | 0 | 0 | 0 | 0 |
| 206 | 10.807 | 10.646 | 10.549 | 10.587 | 10.502 | 10.418 | 10.333 | 10.251 | 10.169 | 0 | 0 | 0 | 0 | 0 | 0 | 0 | 0 | 0 | 0 | 0 |
| 207 | 0 | 0 | 0 | 0 | 0 | 0 | 0 | 0 | 0 | 0 | 0 | 0 | 0 | 0 | 0 | 0 | 0 | 0 | 0 | 0 |
| 208 | 0 | 0 | 0 | 0 | 0 | 0 | 0 | 0 | 0 | 0 | 0 | 0 | 0 | 0 | 0 | 0 | 0 | 0 | 0 | 0 |
| 209 | 0 | 0 | 0 | 0 | 0 | 0 | 0 | 0 | 0 | 0 | 0 | 0 | 0 | 0 | 0 | 0 | 0 | 0 | 0 | 0 |
| 210 | 0 | 0 | 0 | 0 | 0 | 59.325 | 59.325 | 59.325 | 59.325 | 59.325 | 59.325 | 59.325 | 59.325 | 59.325 | 59.325 | 59.325 | 59.325 | 59.325 | 59.325 | 59.325 |
| 211 | 0 | 0 | 0 | 0 | 0 | 0 | 0 | 0 | 0 | 6.847 | 6.847 | 6.847 | 6.847 | 6.847 | 6.847 | 6.847 | 6.847 | 6.847 | 6.847 | 6.847 |
| 212 | 0 | 0 | 0 | 0 | 0 | 0 | 0 | 0 | 0 | 12.873 | 12.873 | 12.873 | 12.873 | 12.873 | 12.873 | 12.873 | 12.873 | 12.873 | 12.873 | 12.873 |
| 213 | 0 | 0 | 0 | 7.434 | 7.434 | 7.396 | 7.359 | 7.323 | 7.286 | 7.25 | 7.213 | 7.177 | 7.141 | 7.106 | 7.07 | 7.035 | 7 | 6.965 | 6.93 | 6.895 |
| 214 | 0 | 0 | 0 | 23.787 | 23.787 | 23.668 | 23.55 | 23.432 | 23.315 | 23.199 | 23.082 | 22.967 | 22.852 | 22.738 | 22.625 | 22.511 | 22.399 | 22.287 | 22.175 | 22.065 |
| 215 | 0 | 0 | 0 | 0 | 0 | 0 | 0 | 6.191 | 6.191 | 6.191 | 6.191 | 6.191 | 6.191 | 6.191 | 6.191 | 6.191 | 6.191 | 6.191 | 6.191 | 6.191 |
| 216 | 0 | 0 | 0 | 0 | 0 | 0 | 0 | 0 | 0 | 0 | 12.687 | 12.687 | 12.687 | 12.687 | 12.687 | 12.687 | 12.687 | 12.687 | 12.687 | 12.687 |
| 217 | 0 | 0 | 0 | 6.724 | 6.724 | 6.691 | 6.657 | 6.624 | 6.591 | 6.558 | 6.525 | 6.492 | 6.459 | 6.428 | 6.395 | 6.364 | 6.331 | 6.299 | 6.268 | 6.237 |
| 218 | 0 | 0 | 0 | 0 | 0 | 0 | 0 | 0 | 0 | 0 | 0 | 0 | 39.201 | 39.201 | 39.201 | 39.201 | 39.201 | 39.201 | 39.201 | 39.201 |
| 219 | 0 | 0 | 0 | 14.792 | 14.792 | 14.719 | 14.644 | 14.571 | 14.498 | 14.426 | 14.355 | 14.283 | 14.211 | 14.139 | 14.069 | 13.999 | 13.929 | 13.859 | 13.79 | 13.721 |
| 220 | 0 | 0 | 0 | 0 | 45.978 | 45.978 | 45.702 | 45.428 | 45.156 | 44.884 | 44.615 | 44.348 | 44.082 | 43.817 | 43.555 | 43.293 | 43.033 | 42.775 | 42.518 | 42.263 |
| 221 | 0 | 0 | 0 | 14.942 | 14.942 | 14.867 | 14.792 | 14.719 | 14.644 | 14.571 | 14.5 | 14.426 | 14.355 | 14.283 | 14.211 | 14.141 | 14.069 | 13.999 | 13.929 | 13.86 |
| 222 | 0 | 0 | 0 | 29.884 | 29.884 | 29.734 | 29.586 | 29.437 | 29.29 | 29.144 | 28.998 | 28.853 | 28.709 | 28.566 | 28.422 | 28.28 | 28.138 | 27.998 | 27.859 | 27.719 |
| 223 | 0 | 0 | 0 | 0 | 6.693 | 6.693 | 6.681 | 6.668 | 6.654 | 6.641 | 6.628 | 6.615 | 6.602 | 6.588 | 6.575 | 6.563 | 6.55 | 6.537 | 6.523 | 6.511 |
| 224 | 0 | 0 | 0 | 14.792 | 14.792 | 14.719 | 14.644 | 14.571 | 14.498 | 14.426 | 14.355 | 14.283 | 14.211 | 14.139 | 14.069 | 13.999 | 13.929 | 13.859 | 13.79 | 13.721 |
| 225 | 0 | 0 | 0 | 0 | 0 | 0 | 0 | 0 | 0 | 12.325 | 12.325 | 12.325 | 12.325 | 12.325 | 12.325 | 12.325 | 12.325 | 12.325 | 12.325 | 16.77 |
| 226 | 0 | 0 | 0 | 0 | 0 | 0 | 0 | 0 | 0 | 0 | 0 | 0 | 0 | 0 | 0 | 0 | 0 | 0 | 0 | 0 |
| 227 | 0 | 0 | 0 | 0 | 0 | 0 | 0 | 0 | 0 | 0 | 0 | 0 | 0 | 0 | 0 | 0 | 0 | 0 | 0 | 0 |
| 228 | 0 | 0 | 0 | 0 | 0 | 0 | 0 | 0 | 0 | 0 | 0 | 0 | 0 | 0 | 0 | 0 | 0 | 0 | 0 | 0 |
| 229 | 0 | 0 | 0 | 0 | 0 | 0 | 0 | 0 | 0 | 0 | 0 | 0 | 0 | 0 | 0 | 0 | 0 | 0 | 0 | 0 |
| 230 | 0 | 0 | 0 | 0 | 0 | 0 | 0 | 0 | 0 | 0 | 0 | 0 | 0 | 0 | 0 | 0 | 0 | 0 | 0 | 0 |
| 231 | 0 | 0 | 0 | 0 | 0 | 0 | 0 | 0 | 0 | 0 | 0 | 0 | 0 | 0 | 0 | 0 | 0 | 0 | 0 | 0 |
| 232 | 0 | 0 | 0 | 0 | 0 | 0 | 0 | 0 | 0 | 0 | 0 | 0 | 0 | 0 | 0 | 0 | 0 | 0 | 0 | 0 |
| 233 | 0 | 0 | 0 | 0 | 0 | 0 | 0 | 0 | 0 | 0 | 0 | 0 | 0 | 0 | 0 | 0 | 0 | 0 | 0 | 0 |
| 234 | 0 | 0 | 0 | 0 | 0 | 0 | 0 | 0 | 0 | 0 | 0 | 0 | 0 | 0 | 0 | 0 | 0 | 0 | 0 | 0 |
| 235 | 0 | 0 | 0 | 0 | 0 | 0 | 0 | 0 | 0 | 0 | 0 | 0 | 0 | 0 | 0 | 0 | 0 | 0 | 0 | 0 |
| 236 | 0 | 0 | 0 | 0 | 0 | 0 | 0 | 0 | 0 | 0 | 0 | 0 | 0 | 0 | 0 | 0 | 0 | 0 | 0 | 0 |
| 237 | 0 | 0 | 0 | 0 | 0 | 0 | 0 | 0 | 0 | 0 | 0 | 0 | 0 | 0 | 0 | 0 | 0 | 0 | 0 | 0 |
| 238 | 12.463 | 12.427 | 12.385 | 12.473 | 12.473 | 12.473 | 12.473 | 12.473 | 12.473 | 12.473 | 12.473 | 12.473 | 12.473 | 12.473 | 12.473 | 12.473 | 12.473 | 12.473 | 12.473 | 12.473 |
| 239 | 6.231 | 6.213 | 6.193 | 6.237 | 6.237 | 6.237 | 6.237 | 6.237 | 6.237 | 6.237 | 6.237 | 6.237 | 6.237 | 6.237 | 6.237 | 6.237 | 6.237 | 6.237 | 6.237 | 6.237 |
| 240 | 0.799 | 0 | 0 | 0 | 0 | 0 | 0 | 0 | 0 | 0 | 0 | 0 | 0 | 0 | 0 | 0 | 0 | 0 | 0 | 0 |
| 241 | 31.916 | 31.823 | 31.717 | 31.942 | 31.942 | 31.942 | 31.942 | 31.942 | 31.942 | 31.942 | 31.942 | 31.942 | 31.942 | 31.942 | 31.942 | 31.942 | 31.942 | 31.942 | 31.942 | 31.942 |
| 242 | 9.587 | 9.559 | 9.527 | 9.595 | 9.595 | 9.595 | 9.595 | 9.595 | 9.595 | 9.595 | 9.595 | 9.595 | 9.595 | 9.595 | 9.595 | 9.595 | 9.595 | 9.595 | 9.595 | 9.595 |
| 243 | 19.956 | 19.899 | 19.832 | 19.973 | 19.973 | 19.973 | 19.973 | 19.973 | 19.973 | 19.973 | 19.973 | 19.973 | 19.973 | 19.973 | 19.973 | 19.973 | 19.973 | 19.973 | 19.973 | 19.973 |
| 244 | 39.945 | 39.829 | 39.696 | 39.978 | 39.978 | 39.978 | 39.978 | 39.978 | 39.978 | 39.978 | 39.978 | 39.978 | 39.978 | 39.978 | 39.978 | 39.978 | 39.978 | 39.978 | 39.978 | 39.978 |
| 245 | 8.868 | 8.842 | 8.813 | 8.875 | 8.875 | 8.875 | 8.875 | 8.875 | 8.875 | 8.875 | 8.875 | 8.875 | 8.875 | 8.875 | 8.875 | 8.875 | 8.875 | 8.875 | 8.875 | 8.875 |
| 246 | 3.259 | 3.25 | 3.239 | 3.262 | 3.262 | 3.262 | 3.262 | 3.262 | 3.262 | 3.262 | 3.262 | 3.262 | 3.262 | 3.262 | 3.262 | 3.262 | 3.262 | 3.262 | 3.262 | 3.262 |
| 247 | 7.909 | 7.886 | 7.86 | 7.916 | 7.916 | 7.916 | 7.916 | 7.916 | 7.916 | 7.916 | 7.916 | 7.916 | 7.916 | 7.916 | 7.916 | 7.916 | 7.916 | 7.916 | 7.916 | 7.916 |
| 248 | 3.116 | 3.107 | 3.096 | 3.118 | 3.118 | 3.118 | 3.118 | 3.118 | 3.118 | 3.118 | 3.118 | 3.118 | 3.118 | 3.118 | 3.118 | 3.118 | 3.118 | 3.118 | 3.118 | 3.118 |
| 249 | 7.909 | 7.886 | 7.86 | 7.916 | 7.916 | 7.916 | 7.916 | 7.916 | 7.916 | 7.916 | 7.916 | 7.916 | 7.916 | 7.916 | 7.916 | 7.916 | 7.916 | 7.916 | 7.916 | 7.916 |
| 250 | 2.277 | 2.27 | 2.263 | 2.279 | 2.279 | 2.279 | 2.279 | 2.279 | 2.279 | 2.279 | 2.279 | 2.279 | 2.279 | 2.279 | 2.279 | 2.279 | 2.279 | 2.279 | 2.279 | 2.279 |
| 251 | 7.909 | 7.886 | 7.86 | 7.916 | 7.916 | 7.916 | 7.916 | 7.916 | 7.916 | 7.916 | 7.916 | 7.916 | 7.916 | 7.916 | 7.916 | 7.916 | 7.916 | 7.916 | 7.916 | 7.916 |
| 252 | 7.909 | 7.886 | 7.86 | 7.916 | 7.916 | 7.916 | 7.916 | 7.916 | 7.916 | 7.916 | 7.916 | 7.916 | 7.916 | 7.916 | 7.916 | 7.916 | 7.916 | 7.916 | 7.916 | 7.916 |
| 253 | 1.558 | 1.553 | 1.548 | 1.559 | 1.559 | 1.559 | 1.559 | 1.559 | 1.559 | 1.559 | 1.559 | 1.559 | 1.559 | 1.559 | 1.559 | 1.559 | 1.559 | 1.559 | 1.559 | 1.559 |
| 254 | 19.173 | 19.118 | 19.054 | 19.189 | 19.189 | 19.189 | 19.189 | 19.189 | 19.189 | 19.189 | 19.189 | 19.189 | 19.189 | 19.189 | 19.189 | 19.189 | 19.189 | 19.189 | 19.189 | 19.189 |
| 255 | 7.51 | 7.488 | 7.463 | 7.516 | 7.516 | 7.516 | 7.516 | 7.516 | 7.516 | 7.516 | 7.516 | 7.516 | 7.516 | 7.516 | 7.516 | 7.516 | 7.516 | 7.516 | 7.516 | 7.516 |
| 256 | 8.029 | 8.006 | 7.979 | 8.036 | 8.036 | 8.036 | 8.036 | 8.036 | 8.036 | 8.036 | 8.036 | 8.036 | 8.036 | 8.036 | 8.036 | 8.036 | 8.036 | 8.036 | 8.036 | 8.036 |
| 257 | 5.153 | 5.138 | 5.121 | 5.157 | 5.157 | 0 | 0 | 0 | 0 | 0 | 0 | 0 | 0 | 0 | 0 | 0 | 0 | 0 | 0 | 0 |
| 258 | 3.275 | 3.266 | 3.255 | 0 | 0 | 0 | 0 | 0 | 0 | 0 | 0 | 0 | 0 | 0 | 0 | 0 | 0 | 0 | 0 | 0 |
| 259 | 13.981 | 0 | 0 | 0 | 0 | 0 | 0 | 0 | 0 | 0 | 0 | 0 | 0 | 0 | 0 | 0 | 0 | 0 | 0 | 0 |
| 260 | 7.909 | 7.886 | 7.86 | 7.916 | 7.916 | 7.916 | 7.916 | 7.916 | 0 | 0 | 0 | 0 | 0 | 0 | 0 | 0 | 0 | 0 | 0 | 0 |
| 261 | 15.994 | 15.948 | 15.894 | 16.007 | 16.007 | 16.007 | 16.007 | 16.007 | 16.007 | 0 | 0 | 0 | 0 | 0 | 0 | 0 | 0 | 0 | 0 | 0 |
| 262 | 0 | 0 | 11.988 | 11.988 | 11.988 | 11.988 | 11.988 | 11.988 | 11.988 | 11.988 | 11.988 | 11.988 | 11.988 | 11.988 | 11.988 | 11.988 | 11.988 | 11.988 | 11.988 | 11.988 |
| 263 | 0 | 0 | 0 | 0 | 0 | 0 | 0 | 0 | 0 | 0 | 0 | 28.316 | 28.316 | 28.316 | 28.316 | 28.316 | 28.316 | 28.316 | 28.316 | 28.316 |
| 264 | 0 | 0 | 0 | 0 | 0 | 12.854 | 12.854 | 12.854 | 12.854 | 12.854 | 12.854 | 12.854 | 12.854 | 12.854 | 12.854 | 12.854 | 12.854 | 12.854 | 12.854 | 12.854 |
| 265 | 0 | 0 | 0 | 0 | 0 | 19.775 | 19.775 | 19.775 | 19.775 | 19.775 | 19.775 | 19.775 | 19.775 | 19.775 | 19.775 | 19.775 | 19.775 | 19.775 | 19.775 | 19.775 |
| 266 | 0 | 0 | 0 | 0 | 0 | 0 | 0 | 0 | 0 | 0 | 0 | 0 | 0 | 0 | 0 | 0 | 0 | 0 | 0 | 0 |
| 267 | 0 | 0 | 0 | 0 | 0 | 0 | 0 | 0 | 0 | 19.804 | 19.804 | 19.804 | 19.804 | 19.804 | 19.804 | 19.804 | 19.804 | 19.804 | 19.804 | 19.804 |
| 268 | 0 | 0 | 0 | 6.477 | 6.477 | 6.477 | 6.477 | 6.477 | 6.477 | 6.477 | 6.477 | 6.477 | 6.477 | 6.477 | 6.477 | 6.477 | 6.477 | 6.477 | 6.477 | 6.477 |
| 269 | 3.915 | 3.903 | 3.89 | 3.918 | 3.998 | 3.998 | 3.998 | 3.998 | 3.998 | 3.998 | 3.998 | 3.998 | 3.998 | 3.998 | 3.998 | 3.998 | 3.998 | 3.998 | 3.998 | 3.998 |
| 270 | 0 | 0 | 0 | 0 | 11.622 | 11.622 | 11.622 | 11.622 | 11.622 | 11.622 | 11.622 | 11.622 | 11.622 | 11.622 | 11.622 | 11.622 | 11.622 | 11.622 | 11.622 | 11.622 |
| 271 | 0 | 0 | 0 | 0 | 37.005 | 37.005 | 37.005 | 37.005 | 37.005 | 37.005 | 37.005 | 37.005 | 37.005 | 37.005 | 37.005 | 37.005 | 37.005 | 37.005 | 37.005 | 37.005 |
| 272 | 0 | 0 | 0 | 0 | 40.52 | 40.52 | 40.52 | 40.52 | 40.52 | 40.52 | 40.52 | 40.52 | 40.52 | 40.52 | 40.52 | 40.52 | 40.52 | 40.52 | 40.52 | 40.52 |
| 273 | 0 | 0 | 0 | 0 | 46.256 | 46.256 | 46.256 | 46.256 | 46.256 | 46.256 | 46.256 | 46.256 | 46.256 | 46.256 | 46.256 | 46.256 | 46.256 | 46.256 | 46.256 | 46.256 |
| 274 | 0 | 0 | 0 | 0 | 21.972 | 21.972 | 21.972 | 21.972 | 21.972 | 21.972 | 21.972 | 21.972 | 21.972 | 21.972 | 21.972 | 21.972 | 21.972 | 21.972 | 21.972 | 21.972 |
| 275 | 0 | 0 | 0 | 0 | 32.379 | 32.379 | 32.379 | 32.379 | 32.379 | 32.379 | 32.379 | 32.379 | 32.379 | 32.379 | 32.379 | 32.379 | 32.379 | 32.379 | 32.379 | 32.379 |
| 276 | 0 | 0 | 0 | 0 | 0 | 0 | 0 | 0 | 0 | 0 | 0 | 0 | 0 | 0 | 0 | 0 | 0 | 0 | 0 | 0 |
| 277 | 0 | 0 | 0 | 0 | 0 | 0 | 0 | 0 | 0 | 0 | 0 | 0 | 0 | 0 | 0 | 0 | 0 | 0 | 0 | 0 |
| 278 | 0 | 0 | 0 | 0 | 0 | 0 | 0 | 0 | 0 | 0 | 0 | 0 | 0 | 0 | 0 | 0 | 0 | 0 | 0 | 0 |
| 279 | 0 | 0 | 0 | 0 | 0 | 0 | 0 | 0 | 0 | 0 | 0 | 0 | 0 | 0 | 0 | 0 | 0 | 0 | 0 | 0 |
| 280 | 0 | 0 | 0 | 0 | 0 | 0 | 0 | 0 | 0 | 0 | 0 | 0 | 0 | 0 | 0 | 0 | 0 | 0 | 0 | 0 |
| 281 | 0 | 0 | 0 | 0 | 0 | 0 | 0 | 0 | 0 | 0 | 0 | 0 | 0 | 0 | 0 | 0 | 0 | 0 | 0 | 0 |
| 282 | 0 | 0 | 0 | 0 | 0 | 0 | 0 | 0 | 0 | 0 | 0 | 0 | 0 | 0 | 0 | 0 | 0 | 0 | 0 | 0 |
| 283 | 0 | 0 | 0 | 0 | 0 | 0 | 0 | 0 | 0 | 0 | 0 | 0 | 0 | 0 | 0 | 0 | 0 | 0 | 0 | 0 |
| 284 | 0 | 0 | 0 | 0 | 0 | 0 | 0 | 0 | 0 | 0 | 0 | 0 | 0 | 0 | 0 | 0 | 0 | 0 | 0 | 0 |
| 285 | 0 | 0 | 0 | 0 | 0 | 0 | 0 | 0 | 0 | 0 | 0 | 0 | 0 | 0 | 0 | 0 | 0 | 0 | 0 | 0 |
| 286 | 0 | 0 | 0 | 0 | 0 | 0 | 0 | 0 | 0 | 0 | 0 | 0 | 0 | 0 | 0 | 0 | 0 | 0 | 0 | 0 |
| 287 | 0 | 0 | 0 | 0 | 0 | 0 | 0 | 0 | 0 | 0 | 0 | 0 | 0 | 0 | 0 | 0 | 0 | 0 | 0 | 0 |
| 288 | 0 | 0 | 0 | 0 | 0 | 0 | 0 | 0 | 0 | 0 | 0 | 0 | 0 | 0 | 0 | 0 | 0 | 0 | 0 | 0 |
| 289 | 0 | 0 | 0 | 0 | 0 | 0 | 0 | 0 | 0 | 0 | 0 | 0 | 0 | 0 | 0 | 0 | 0 | 0 | 0 | 0 |
| 290 | 0 | 0 | 0 | 0 | 0 | 0 | 0 | 0 | 0 | 0 | 0 | 0 | 0 | 0 | 0 | 0 | 0 | 0 | 0 | 0 |
| 291 | 0 | 0 | 0 | 0 | 0 | 0 | 0 | 0 | 0 | 0 | 0 | 0 | 0 | 0 | 0 | 0 | 0 | 0 | 0 | 0 |
| 292 | 0 | 0 | 0 | 0 | 0 | 0 | 0 | 0 | 0 | 0 | 0 | 0 | 0 | 0 | 0 | 0 | 0 | 0 | 0 | 0 |
| 293 | 0 | 0 | 0 | 0 | 0 | 0 | 0 | 0 | 0 | 0 | 0 | 0 | 0 | 0 | 0 | 0 | 0 | 0 | 0 | 0 |
| 294 | 0 | 0 | 0 | 0 | 0 | 0 | 0 | 0 | 0 | 0 | 0 | 0 | 0 | 0 | 0 | 0 | 0 | 0 | 0 | 0 |
| 295 | 0 | 0 | 0 | 0 | 0 | 0 | 0 | 0 | 0 | 0 | 0 | 0 | 0 | 0 | 0 | 0 | 0 | 0 | 0 | 0 |
| 296 | 0 | 0 | 0 | 0 | 0 | 0 | 0 | 0 | 0 | 0 | 0 | 0 | 0 | 0 | 0 | 0 | 0 | 0 | 0 | 0 |
| 297 | 0 | 0 | 0 | 0 | 0 | 0 | 0 | 0 | 0 | 0 | 0 | 0 | 0 | 0 | 0 | 0 | 0 | 0 | 0 | 0 |
| 298 | 0 | 0 | 0 | 0 | 0 | 0 | 0 | 0 | 0 | 0 | 0 | 0 | 0 | 0 | 0 | 0 | 0 | 0 | 0 | 0 |
| 299 | 0 | 0 | 0 | 0 | 0 | 0 | 0 | 0 | 0 | 0 | 0 | 0 | 0 | 0 | 0 | 0 | 0 | 0 | 0 | 0 |
| 300 | 0 | 0 | 0 | 0 | 0 | 0 | 0 | 0 | 0 | 0 | 0 | 0 | 0 | 0 | 0 | 0 | 0 | 0 | 0 | 0 |
| 301 | 13.981 | 0 | 0 | 0 | 0 | 0 | 0 | 0 | 0 | 0 | 0 | 0 | 0 | 0 | 0 | 0 | 0 | 0 | 0 | 0 |
| 302 | 0 | 0 | 0 | 0 | 0 | 0 | 0 | 0 | 0 | 0 | 0 | 0 | 0 | 0 | 0 | 0 | 0 | 0 | 0 | 0 |
| 303 | 0 | 0 | 0 | 0 | 0 | 0 | 0 | 0 | 0 | 0 | 0 | 0 | 0 | 0 | 0 | 0 | 0 | 10.302 | 10.302 | 10.302 |
| 304 | 0 | 0 | 0 | 0 | 0 | 0 | 0 | 0 | 0 | 0 | 0 | 0 | 7.345 | 7.345 | 7.345 | 7.345 | 7.345 | 7.345 | 7.345 | 7.345 |
| 305 | 0 | 0 | 0 | 0 | 0 | 0 | 0 | 0 | 0 | 0 | 12.407 | 12.407 | 12.407 | 12.407 | 12.407 | 12.407 | 12.407 | 12.407 | 12.407 | 12.407 |
| 306 | 0 | 0 | 0 | 0 | 0 | 0 | 0 | 0 | 0 | 0 | 0 | 0 | 0 | 0 | 0 | 0 | 0 | 0 | 0 | 10.302 |
| 307 | 77.213 | 76.675 | 76.592 | 0 | 0 | 0 | 0 | 0 | 0 | 0 | 0 | 0 | 0 | 0 | 0 | 0 | 0 | 0 | 0 | 0 |
| 308 | 77.656 | 77.115 | 77.032 | 0 | 0 | 0 | 0 | 0 | 0 | 0 | 0 | 0 | 0 | 0 | 0 | 0 | 0 | 0 | 0 | 0 |
| 309 | 0 | 0 | 0 | 0 | 0 | 0 | 0 | 0 | 0 | 0 | 0 | 0 | 0 | 0 | 0 | 0 | 0 | 0 | 0 | 0 |
| 310 | 0 | 0 | 0 | 0 | 0 | 0 | 0 | 0 | 0 | 0 | 0 | 0 | 0 | 0 | 0 | 0 | 0 | 0 | 0 | 0 |
| 311 | 0 | 0 | 0 | 0 | 0 | 0 | 0 | 0 | 0 | 0 | 0 | 0 | 0 | 0 | 0 | 0 | 0 | 0 | 0 | 0 |
| 312 | 0 | 0 | 0 | 0 | 0 | 0 | 0 | 0 | 0 | 0 | 0 | 0 | 0 | 0 | 0 | 0 | 0 | 0 | 0 | 0 |
| 313 | 0 | 0 | 0 | 0 | 0 | 0 | 0 | 0 | 0 | 0 | 0 | 0 | 0 | 0 | 0 | 0 | 0 | 0 | 0 | 0 |
| 314 | 0 | 0 | 0 | 0 | 0 | 0 | 0 | 0 | 0 | 0 | 0 | 0 | 0 | 0 | 0 | 0 | 0 | 0 | 0 | 0 |
| 315 | 0 | 0 | 0 | 0 | 0 | 0 | 0 | 0 | 0 | 14.113 | 14.113 | 14.113 | 14.113 | 14.113 | 14.113 | 14.113 | 14.113 | 14.113 | 14.113 | 14.113 |
| 316 | 0 | 0 | 0 | 0 | 0 | 0 | 0 | 0 | 0 | 12.873 | 12.873 | 12.873 | 12.873 | 12.873 | 12.873 | 12.873 | 12.873 | 12.873 | 12.873 | 12.873 |
| 317 | 0 | 0 | 0 | 0 | 0 | 0 | 0 | 0 | 0 | 0 | 0 | 12.308 | 12.308 | 12.308 | 12.308 | 12.308 | 12.308 | 12.308 | 12.308 | 12.308 |
| 318 | 0 | 0 | 0 | 0 | 0 | 0 | 0 | 0 | 0 | 0 | 0 | 0 | 0 | 0 | 0 | 0 | 0 | 0 | 0 | 0 |
| 319 | 0 | 0 | 0 | 0 | 0 | 0 | 0 | 0 | 0 | 0 | 0 | 0 | 0 | 0 | 0 | 0 | 0 | 0 | 0 | 0 |